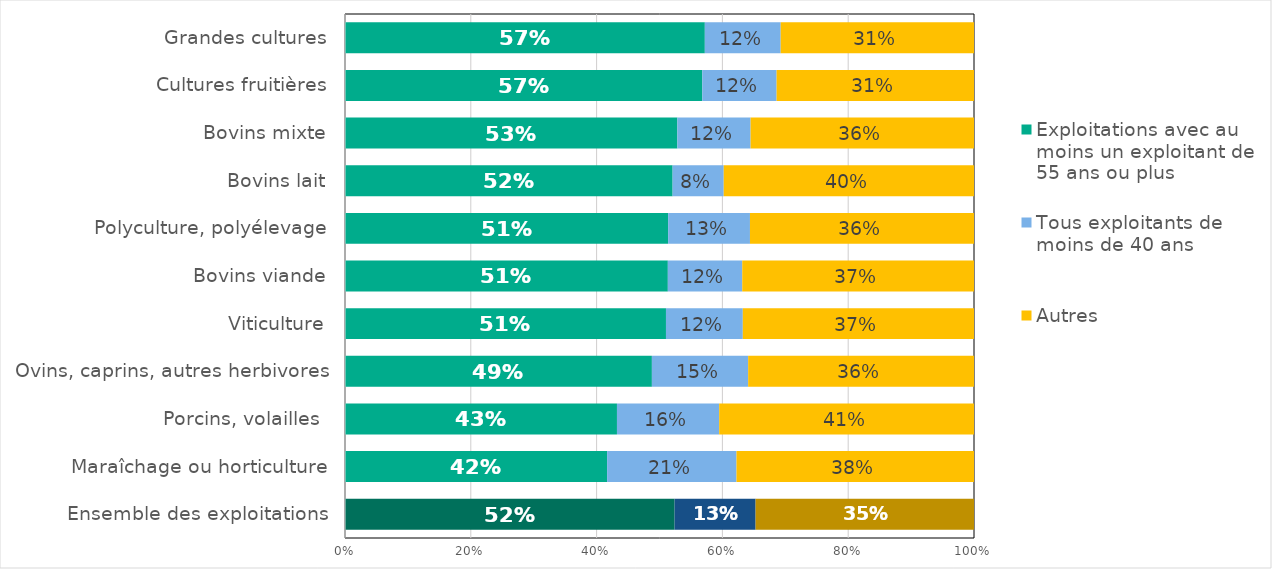
| Category | Exploitations avec au moins un exploitant de 55 ans ou plus | Tous exploitants de moins de 40 ans | Autres |
|---|---|---|---|
| Ensemble des exploitations | 33640 | 8269 | 22291 |
| Maraîchage ou horticulture | 1011 | 499 | 916 |
| Porcins, volailles  | 1333 | 501 | 1249 |
| Ovins, caprins, autres herbivores | 3507 | 1100 | 2581 |
| Viticulture | 5334 | 1277 | 3842 |
| Bovins viande | 5111 | 1178 | 3669 |
| Polyculture, polyélevage | 3779 | 957 | 2620 |
| Bovins lait | 737 | 115 | 563 |
| Bovins mixte | 363 | 80 | 244 |
| Cultures fruitières | 1620 | 337 | 895 |
| Grandes cultures | 10454 | 2204 | 5616 |